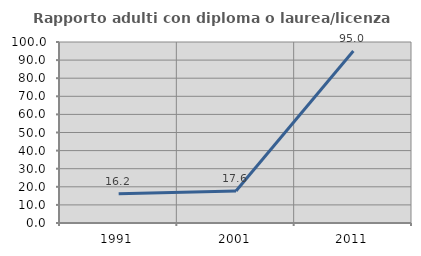
| Category | Rapporto adulti con diploma o laurea/licenza media  |
|---|---|
| 1991.0 | 16.216 |
| 2001.0 | 17.647 |
| 2011.0 | 95 |